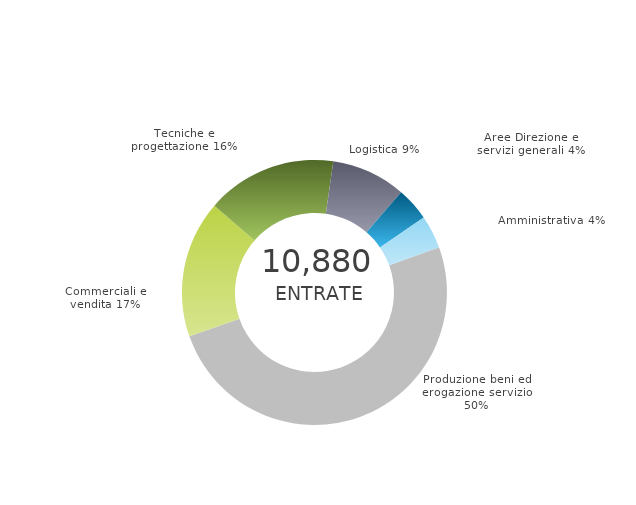
| Category | Series 0 | Series 1 |
|---|---|---|
| Produzione beni ed erogazione servizio | 0 | 0.502 |
| Commerciali e vendita | 0 | 0.167 |
| Tecniche e progettazione | 0 | 0.159 |
| Logistica | 0 | 0.091 |
| Aree Direzione e servizi generali | 0 | 0.041 |
| Amministrativa | 0 | 0.04 |